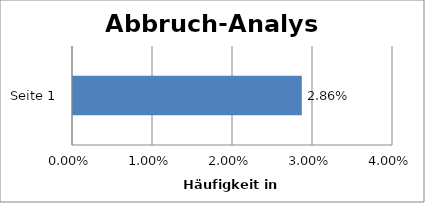
| Category | Seite |
|---|---|
| Seite 1 | 0.029 |